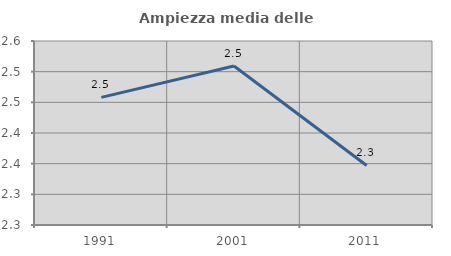
| Category | Ampiezza media delle famiglie |
|---|---|
| 1991.0 | 2.458 |
| 2001.0 | 2.509 |
| 2011.0 | 2.347 |